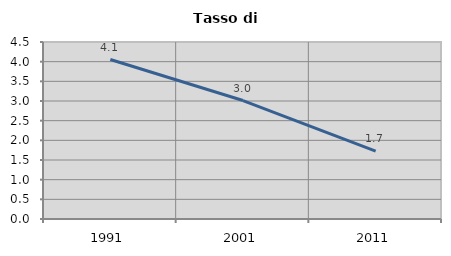
| Category | Tasso di disoccupazione   |
|---|---|
| 1991.0 | 4.055 |
| 2001.0 | 3.012 |
| 2011.0 | 1.726 |